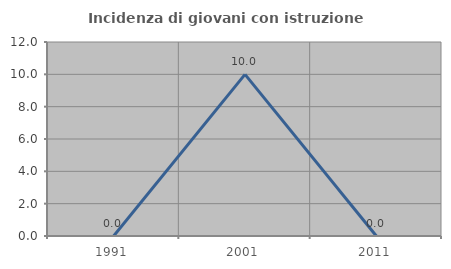
| Category | Incidenza di giovani con istruzione universitaria |
|---|---|
| 1991.0 | 0 |
| 2001.0 | 10 |
| 2011.0 | 0 |